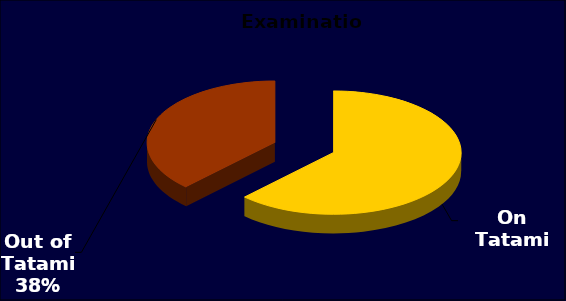
| Category | Series 0 |
|---|---|
| On Tatami | 385 |
| Out of Tatami | 234 |